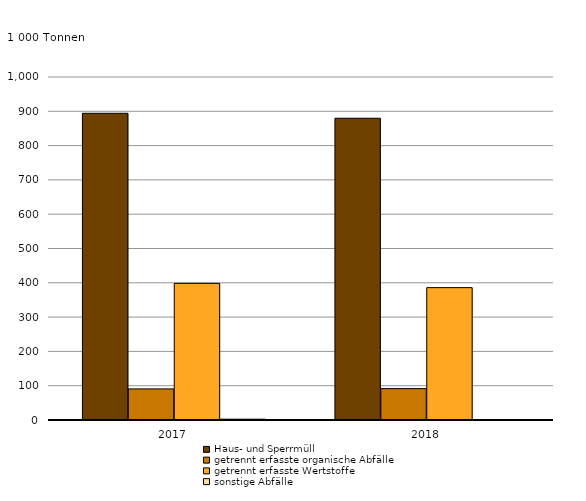
| Category | Haus- und Sperrmüll | getrennt erfasste organische Abfälle | getrennt erfasste Wertstoffe | sonstige Abfälle |
|---|---|---|---|---|
| 2017.0 | 894260 | 90696 | 398397 | 2365 |
| 2018.0 | 879696 | 91480 | 385912 | 1306 |